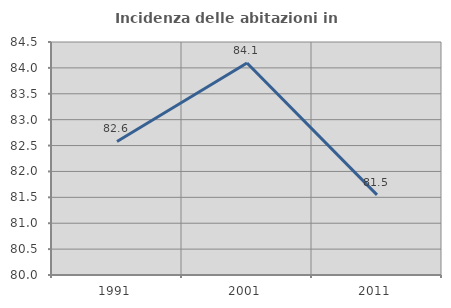
| Category | Incidenza delle abitazioni in proprietà  |
|---|---|
| 1991.0 | 82.578 |
| 2001.0 | 84.093 |
| 2011.0 | 81.548 |